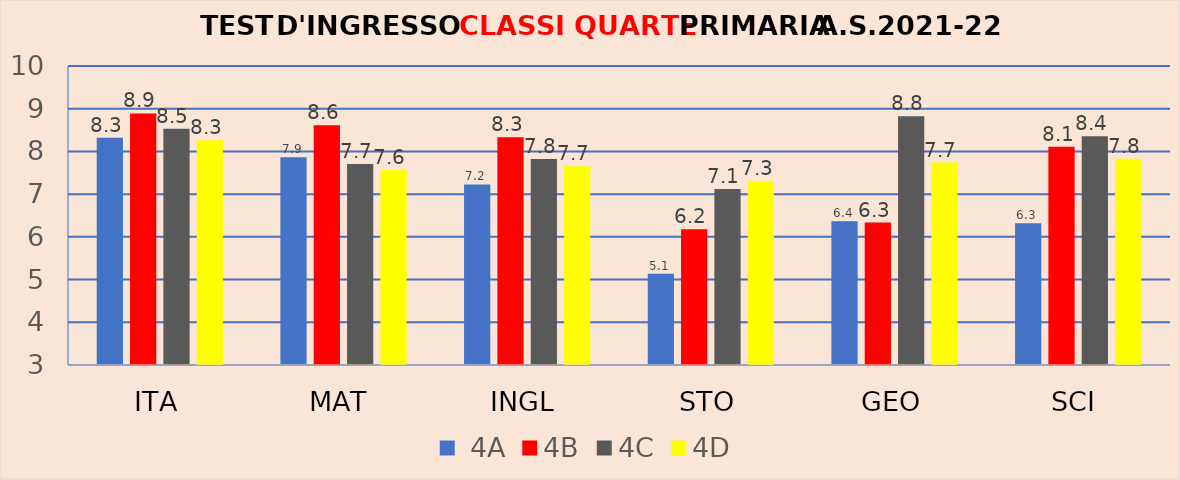
| Category |  4A | 4B | 4C | 4D |
|---|---|---|---|---|
| ITA | 8.318 | 8.889 | 8.529 | 8.261 |
| MAT | 7.864 | 8.611 | 7.706 | 7.565 |
| INGL | 7.227 | 8.333 | 7.824 | 7.652 |
| STO | 5.136 | 6.176 | 7.118 | 7.304 |
| GEO | 6.364 | 6.333 | 8.824 | 7.739 |
| SCI | 6.318 | 8.111 | 8.353 | 7.826 |